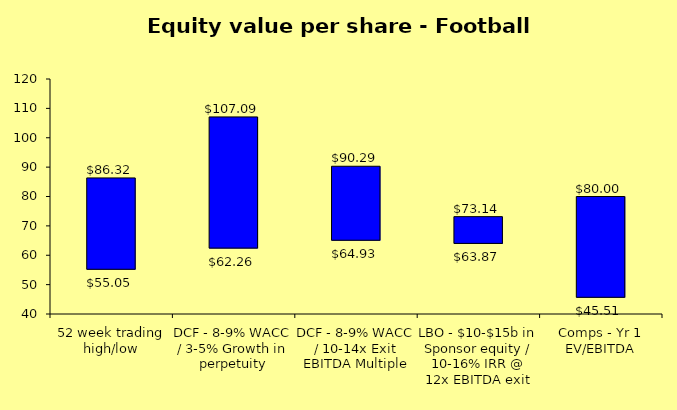
| Category | Low | Difference | High |
|---|---|---|---|
| 52 week trading high/low | 55.05 | 31.27 | 86.32 |
| DCF - 8-9% WACC / 3-5% Growth in perpetuity | 62.257 | 44.832 | 107.089 |
| DCF - 8-9% WACC / 10-14x Exit EBITDA Multiple | 64.932 | 25.362 | 90.294 |
| LBO - $10-$15b in Sponsor equity / 10-16% IRR @ 12x EBITDA exit | 63.866 | 9.278 | 73.144 |
| Comps - Yr 1 EV/EBITDA | 45.512 | 34.488 | 80 |